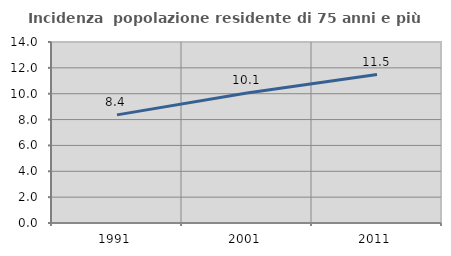
| Category | Incidenza  popolazione residente di 75 anni e più |
|---|---|
| 1991.0 | 8.362 |
| 2001.0 | 10.053 |
| 2011.0 | 11.483 |